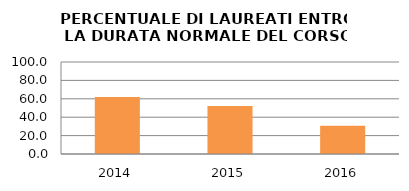
| Category | 2014 2015 2016 |
|---|---|
| 2014.0 | 61.905 |
| 2015.0 | 52.174 |
| 2016.0 | 30.769 |